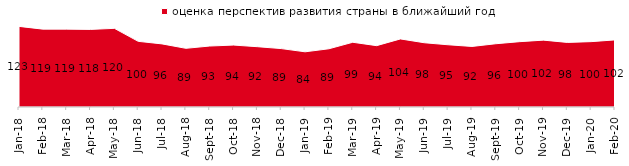
| Category | оценка перспектив развития страны в ближайший год |
|---|---|
| 2018-01-01 | 122.9 |
| 2018-02-01 | 118.7 |
| 2018-03-01 | 118.7 |
| 2018-04-01 | 118.3 |
| 2018-05-01 | 119.9 |
| 2018-06-01 | 100.1 |
| 2018-07-01 | 96.2 |
| 2018-08-01 | 89.45 |
| 2018-09-01 | 92.95 |
| 2018-10-01 | 94.4 |
| 2018-11-01 | 91.916 |
| 2018-12-01 | 89.05 |
| 2019-01-01 | 84.15 |
| 2019-02-01 | 88.75 |
| 2019-03-01 | 98.657 |
| 2019-04-01 | 93.515 |
| 2019-05-01 | 103.764 |
| 2019-06-01 | 97.955 |
| 2019-07-01 | 94.851 |
| 2019-08-01 | 92.308 |
| 2019-09-01 | 96.436 |
| 2019-10-01 | 99.604 |
| 2019-11-01 | 101.931 |
| 2019-12-01 | 98.465 |
| 2020-01-01 | 99.653 |
| 2020-02-01 | 102.277 |